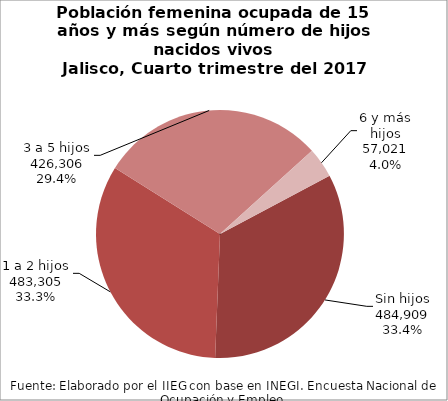
| Category | Series 0 |
|---|---|
| Sin hijos | 484909 |
| 1 a 2 hijos | 483305 |
| 3 a 5 hijos | 426306 |
| 6 y más hijos | 57021 |